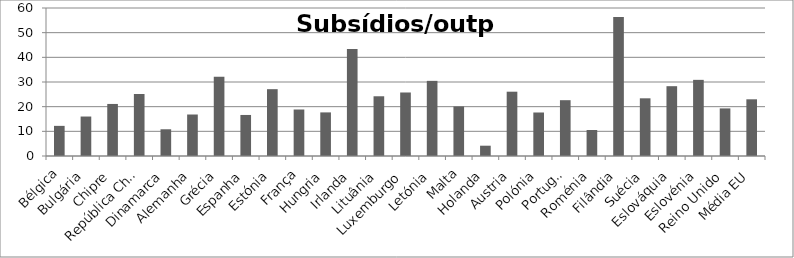
| Category | Series 0 |
|---|---|
| Bélgica | 12.216 |
| Bulgária | 16.002 |
| Chipre | 21.101 |
| República Checa | 25.136 |
| Dinamarca | 10.835 |
| Alemanha | 16.823 |
| Grécia | 32.129 |
| Espanha | 16.637 |
| Estónia | 27.094 |
| França | 18.85 |
| Hungria | 17.676 |
| Irlanda | 43.35 |
| Lituânia | 24.216 |
| Luxemburgo | 25.748 |
| Letónia | 30.46 |
| Malta | 20.089 |
| Holanda | 4.176 |
| Austria | 26.069 |
| Polónia | 17.638 |
| Portugal | 22.628 |
| Roménia | 10.53 |
| Filândia | 56.379 |
| Suécia | 23.389 |
| Eslováquia | 28.302 |
| Eslovénia | 30.868 |
| Reino Unido | 19.296 |
| Média EU | 22.986 |